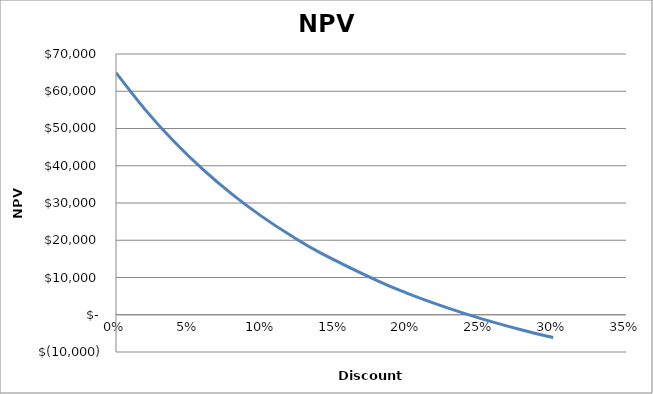
| Category | Series 0 |
|---|---|
| 0.0 | 65000 |
| 0.02 | 55073.163 |
| 0.04 | 46428.133 |
| 0.06 | 38871.249 |
| 0.08 | 32241.737 |
| 0.1 | 26405.57 |
| 0.12 | 21250.571 |
| 0.14 | 16682.489 |
| 0.18 | 9001.327 |
| 0.2 | 5763.826 |
| 0.22 | 2860.633 |
| 0.24 | 250.112 |
| 0.26 | -2103.449 |
| 0.28 | -4230.772 |
| 0.3 | -6158.367 |